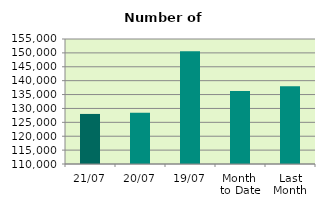
| Category | Series 0 |
|---|---|
| 21/07 | 128022 |
| 20/07 | 128482 |
| 19/07 | 150624 |
| Month 
to Date | 136319.333 |
| Last
Month | 138016.909 |